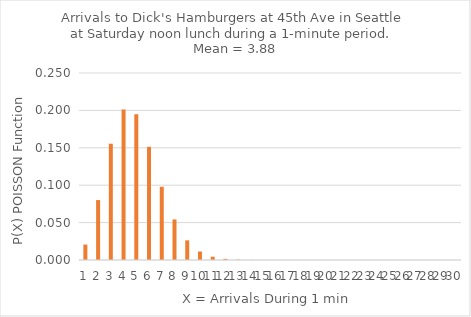
| Category | P(X) POISSON Function |
|---|---|
| 0 | 0.021 |
| 1 | 0.08 |
| 2 | 0.155 |
| 3 | 0.201 |
| 4 | 0.195 |
| 5 | 0.151 |
| 6 | 0.098 |
| 7 | 0.054 |
| 8 | 0.026 |
| 9 | 0.011 |
| 10 | 0.004 |
| 11 | 0.002 |
| 12 | 0.001 |
| 13 | 0 |
| 14 | 0 |
| 15 | 0 |
| 16 | 0 |
| 17 | 0 |
| 18 | 0 |
| 19 | 0 |
| 20 | 0 |
| 21 | 0 |
| 22 | 0 |
| 23 | 0 |
| 24 | 0 |
| 25 | 0 |
| 26 | 0 |
| 27 | 0 |
| 28 | 0 |
| 29 | 0 |